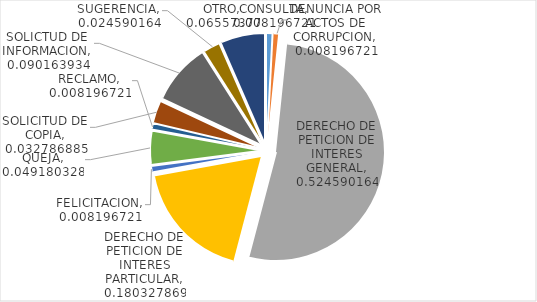
| Category | Series 0 |
|---|---|
| CONSULTA | 0.008 |
| DENUNCIA POR ACTOS DE CORRUPCION | 0.008 |
| DERECHO DE PETICION DE INTERES GENERAL | 0.525 |
| DERECHO DE PETICION DE INTERES PARTICULAR | 0.18 |
| FELICITACION | 0.008 |
| QUEJA | 0.049 |
| RECLAMO | 0.008 |
| SOLICITUD DE COPIA | 0.033 |
| SOLICTUD DE INFORMACION | 0.09 |
| SUGERENCIA | 0.025 |
| OTRO | 0.066 |